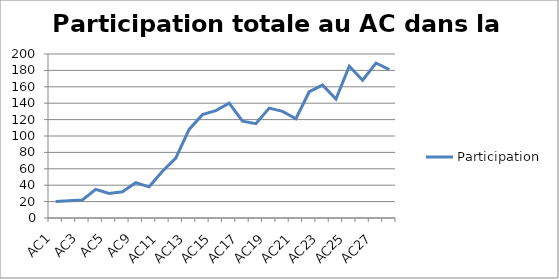
| Category | Participation |
|---|---|
| AC1 | 20 |
| AC2 | 21 |
| AC3 | 22 |
| AC4 | 35 |
| AC5 | 30 |
| AC8 | 32 |
| AC9 | 43 |
| AC10 | 38 |
| AC11 | 57 |
| AC12 | 73 |
| AC13 | 108 |
| AC14 | 126 |
| AC15 | 131 |
| AC16 | 140 |
| AC17 | 118 |
| AC18 | 115 |
| AC19 | 134 |
| AC20 | 130 |
| AC21 | 121 |
| AC22 | 154 |
| AC23 | 162 |
| AC24 | 145 |
| AC25 | 185 |
| AC26 | 168 |
| AC27 | 189 |
| AC28 | 181 |